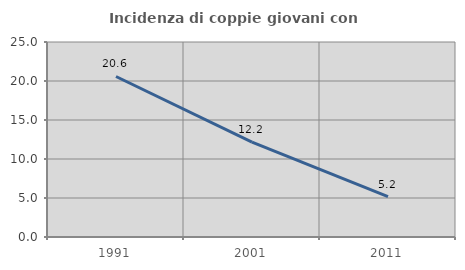
| Category | Incidenza di coppie giovani con figli |
|---|---|
| 1991.0 | 20.579 |
| 2001.0 | 12.169 |
| 2011.0 | 5.168 |